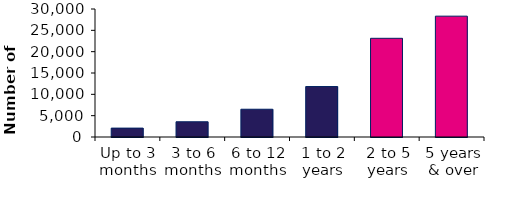
| Category | Series 1 |
|---|---|
| Up to 3 months | 2082 |
| 3 to 6 months | 3570 |
| 6 to 12 months | 6507 |
| 1 to 2 years | 11823 |
| 2 to 5 years | 23132 |
| 5 years & over | 28321 |